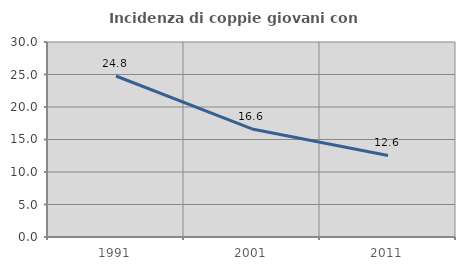
| Category | Incidenza di coppie giovani con figli |
|---|---|
| 1991.0 | 24.771 |
| 2001.0 | 16.629 |
| 2011.0 | 12.552 |